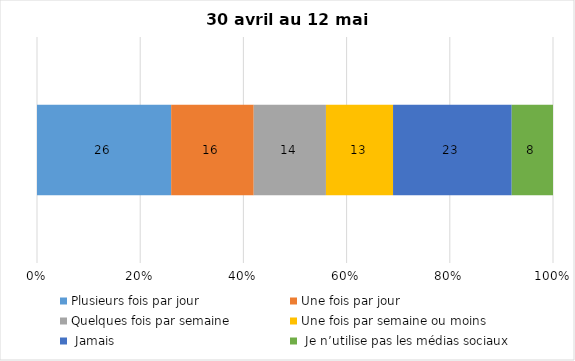
| Category | Plusieurs fois par jour | Une fois par jour | Quelques fois par semaine   | Une fois par semaine ou moins   |  Jamais   |  Je n’utilise pas les médias sociaux |
|---|---|---|---|---|---|---|
| 0 | 26 | 16 | 14 | 13 | 23 | 8 |